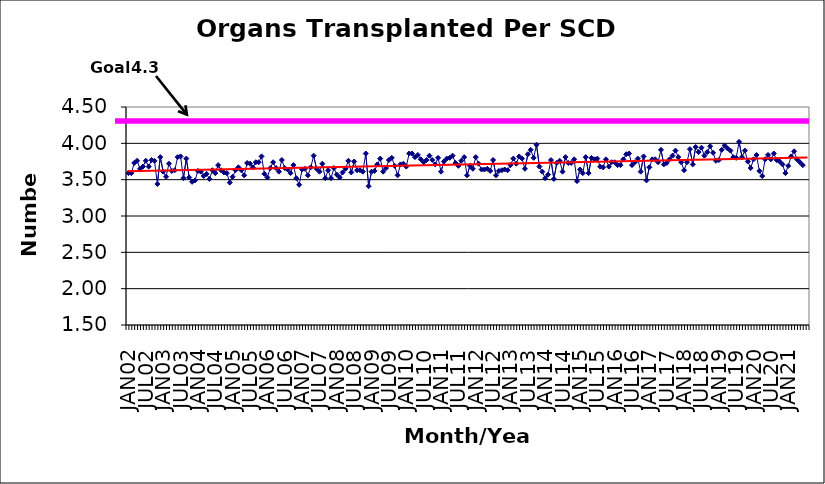
| Category | Series 0 |
|---|---|
| JAN02 | 3.59 |
| FEB02 | 3.59 |
| MAR02 | 3.73 |
| APR02 | 3.76 |
| MAY02 | 3.65 |
| JUN02 | 3.68 |
| JUL02 | 3.76 |
| AUG02 | 3.68 |
| SEP02 | 3.77 |
| OCT02 | 3.76 |
| NOV02 | 3.44 |
| DEC02 | 3.81 |
| JAN03 | 3.61 |
| FEB03 | 3.54 |
| MAR03 | 3.72 |
| APR03 | 3.62 |
| MAY03 | 3.63 |
| JUN03 | 3.81 |
| JUL03 | 3.82 |
| AUG03 | 3.52 |
| SEP03 | 3.79 |
| OCT03 | 3.53 |
| NOV03 | 3.47 |
| DEC03 | 3.49 |
| JAN04 | 3.62 |
| FEB04 | 3.61 |
| MAR04 | 3.55 |
| APR04 | 3.58 |
| MAY04 | 3.51 |
| JUN04 | 3.63 |
| JUL04 | 3.59 |
| AUG04 | 3.7 |
| SEP04 | 3.63 |
| OCT04 | 3.6 |
| NOV04 | 3.59 |
| DEC04 | 3.46 |
| JAN05 | 3.54 |
| FEB05 | 3.63 |
| MAR05 | 3.67 |
| APR05 | 3.63 |
| MAY05 | 3.56 |
| JUN05 | 3.73 |
| JUL05 | 3.72 |
| AUG05 | 3.67 |
| SEP05 | 3.74 |
| OCT05 | 3.74 |
| NOV05 | 3.82 |
| DEC05 | 3.58 |
| JAN06 | 3.53 |
| FEB06 | 3.66 |
| MAR06 | 3.74 |
| APR06 | 3.66 |
| MAY06 | 3.61 |
| JUN06 | 3.77 |
| JUL06 | 3.66 |
| AUG06 | 3.64 |
| SEP06 | 3.59 |
| OCT06 | 3.7 |
| NOV06 | 3.52 |
| DEC06 | 3.43 |
| JAN07 | 3.64 |
| FEB07 | 3.65 |
| MAR07 | 3.56 |
| APR07 | 3.67 |
| MAY07 | 3.83 |
| JUN07 | 3.65 |
| JUL07 | 3.61 |
| AUG07 | 3.72 |
| SEP07 | 3.52 |
| OCT07 | 3.63 |
| NOV07 | 3.52 |
| DEC07 | 3.66 |
| JAN08 | 3.57 |
| FEB08 | 3.53 |
| MAR08 | 3.6 |
| APR08 | 3.65 |
| MAY08 | 3.76 |
| JUN08 | 3.6 |
| JUL08 | 3.75 |
| AUG08 | 3.63 |
| SEP08 | 3.63 |
| OCT08 | 3.61 |
| NOV08 | 3.86 |
| DEC08 | 3.41 |
| JAN09 | 3.61 |
| FEB09 | 3.62 |
| MAR09 | 3.71 |
| APR09 | 3.79 |
| MAY09 | 3.61 |
| JUN09 | 3.66 |
| JUL09 | 3.77 |
| AUG09 | 3.8 |
| SEP09 | 3.69 |
| OCT09 | 3.56 |
| NOV09 | 3.71 |
| DEC09 | 3.72 |
| JAN10 | 3.68 |
| FEB10 | 3.86 |
| MAR10 | 3.86 |
| APR10 | 3.81 |
| MAY10 | 3.84 |
| JUN10 | 3.78 |
| JUL10 | 3.74 |
| AUG10 | 3.77 |
| SEP10 | 3.83 |
| OCT10 | 3.77 |
| NOV10 | 3.71 |
| DEC10 | 3.8 |
| JAN11 | 3.61 |
| FEB11 | 3.75 |
| MAR11 | 3.79 |
| APR11 | 3.8 |
| MAY11 | 3.83 |
| JUN11 | 3.73 |
| JUL11 | 3.69 |
| AUG11 | 3.76 |
| SEP11 | 3.81 |
| OCT11 | 3.56 |
| NOV11 | 3.69 |
| DEC11 | 3.65 |
| JAN12 | 3.81 |
| FEB12 | 3.72 |
| MAR12 | 3.64 |
| APR12 | 3.64 |
| MAY12 | 3.65 |
| JUN12 | 3.62 |
| JUL12 | 3.77 |
| AUG12 | 3.56 |
| SEP12 | 3.62 |
| OCT12 | 3.63 |
| NOV12 | 3.64 |
| DEC12 | 3.63 |
| JAN13 | 3.7 |
| FEB13 | 3.79 |
| MAR13 | 3.72 |
| APR13 | 3.82 |
| MAY13 | 3.79 |
| JUN13 | 3.65 |
| JUL13 | 3.85 |
| AUG13 | 3.91 |
| SEP13 | 3.8 |
| OCT13 | 3.98 |
| NOV13 | 3.68 |
| DEC13 | 3.61 |
| JAN14 | 3.52 |
| FEB14 | 3.57 |
| MAR14 | 3.77 |
| APR14 | 3.51 |
| MAY14 | 3.73 |
| JUN14 | 3.76 |
| JUL14 | 3.61 |
| AUG14 | 3.81 |
| SEP14 | 3.73 |
| OCT14 | 3.73 |
| NOV14 | 3.78 |
| DEC14 | 3.48 |
| JAN15 | 3.64 |
| FEB15 | 3.59 |
| MAR15 | 3.81 |
| APR15 | 3.59 |
| MAY15 | 3.8 |
| JUN15 | 3.78 |
| JUL15 | 3.79 |
| AUG15 | 3.68 |
| SEP15 | 3.67 |
| OCT15 | 3.78 |
| NOV15 | 3.68 |
| DEC15 | 3.74 |
| JAN16 | 3.74 |
| FEB16 | 3.7 |
| MAR16 | 3.7 |
| APR16 | 3.78 |
| MAY16 | 3.85 |
| JUN16 | 3.86 |
| JUL16 | 3.7 |
| AUG16 | 3.74 |
| SEP16 | 3.79 |
| OCT16 | 3.61 |
| NOV16 | 3.82 |
| DEC16 | 3.49 |
| JAN17 | 3.67 |
| FEB17 | 3.78 |
| MAR17 | 3.78 |
| APR17 | 3.74 |
| MAY17 | 3.91 |
| JUN17 | 3.71 |
| JUL17 | 3.73 |
| AUG17 | 3.78 |
| SEP17 | 3.83 |
| OCT17 | 3.9 |
| NOV17 | 3.81 |
| DEC17 | 3.74 |
| JAN18 | 3.63 |
| FEB18 | 3.74 |
| MAR18 | 3.92 |
| APR18 | 3.71 |
| MAY18 | 3.95 |
| JUN18 | 3.88 |
| JUL18 | 3.94 |
| AUG18 | 3.83 |
| SEP18 | 3.88 |
| OCT18 | 3.96 |
| NOV18 | 3.87 |
| DEC18 | 3.76 |
| JAN19 | 3.77 |
| FEB19 | 3.91 |
| MAR19 | 3.97 |
| APR19 | 3.93 |
| MAY19 | 3.9 |
| JUN19 | 3.81 |
| JUL19 | 3.8 |
| AUG19 | 4.02 |
| SEP19 | 3.81 |
| OCT19 | 3.9 |
| NOV19 | 3.75 |
| DEC19 | 3.66 |
| JAN20 | 3.78 |
| FEB20 | 3.84 |
| MAR20 | 3.62 |
| APR20 | 3.55 |
| MAY20 | 3.78 |
| JUN20 | 3.84 |
| JUL20 | 3.78 |
| AUG20 | 3.86 |
| SEP20 | 3.77 |
| OCT20 | 3.75 |
| NOV20 | 3.71 |
| DEC20 | 3.59 |
| JAN21 | 3.69 |
| FEB21 | 3.82 |
| MAR21 | 3.89 |
| APR21 | 3.78 |
| MAY21 | 3.74 |
| JUN21 | 3.7 |